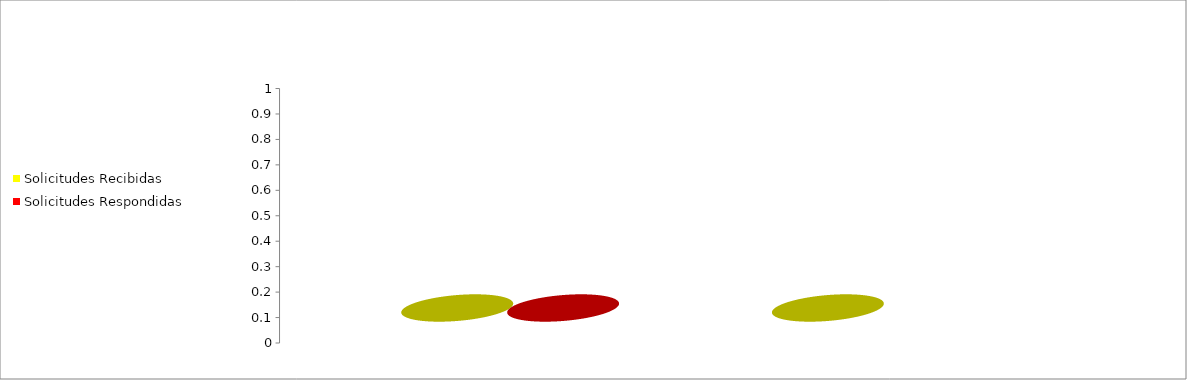
| Category | Solicitudes Recibidas | Solicitudes Respondidas |
|---|---|---|
| 0.0 | 0 | 0 |